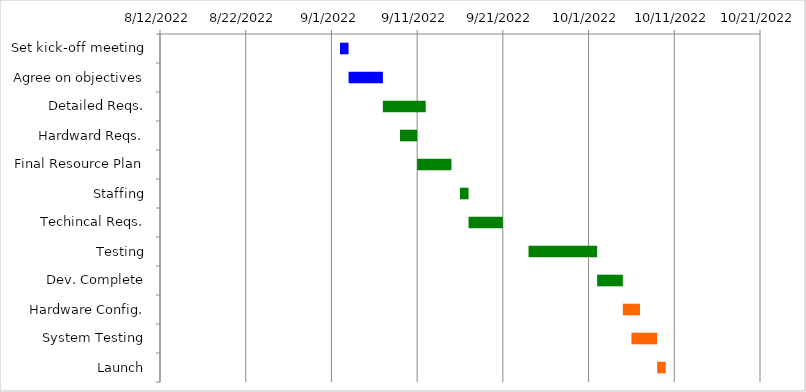
| Category | Start | Days |
|---|---|---|
| Set kick-off meeting | 9/2/22 | 1 |
| Agree on objectives | 9/3/22 | 4 |
| Detailed Reqs. | 9/7/22 | 5 |
| Hardward Reqs. | 9/9/22 | 2 |
| Final Resource Plan | 9/11/22 | 4 |
| Staffing | 9/16/22 | 1 |
| Techincal Reqs. | 9/17/22 | 4 |
| Testing | 9/24/22 | 8 |
| Dev. Complete | 10/2/22 | 3 |
| Hardware Config. | 10/5/22 | 2 |
| System Testing | 10/6/22 | 3 |
| Launch | 10/9/22 | 1 |